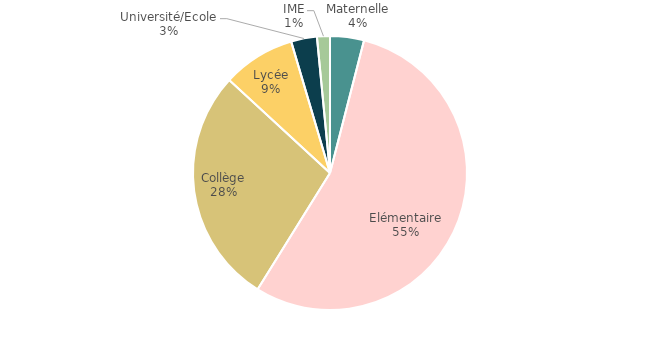
| Category | Series 0 |
|---|---|
| Maternelle | 21 |
| Elémentaire | 288 |
| Collège | 147 |
| Lycée | 45 |
| Université/Ecole | 16 |
| IME | 8 |